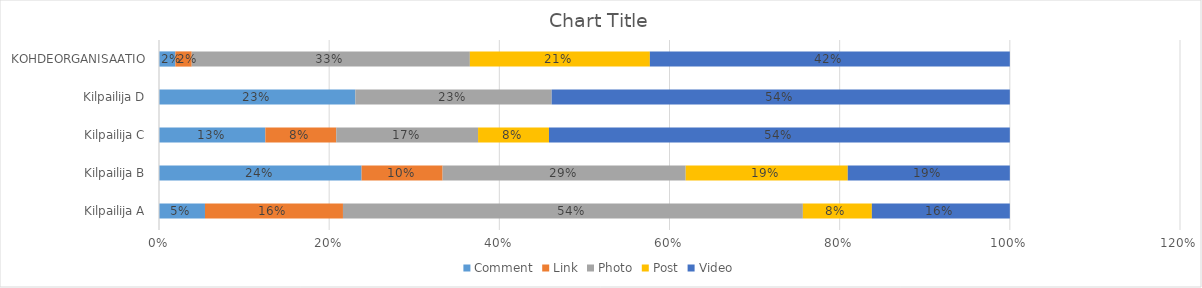
| Category | Comment | Link | Photo | Post | Video |
|---|---|---|---|---|---|
| Kilpailija A | 0.054 | 0.162 | 0.541 | 0.081 | 0.162 |
| Kilpailija B | 0.238 | 0.095 | 0.286 | 0.19 | 0.19 |
| Kilpailija C | 0.125 | 0.083 | 0.167 | 0.083 | 0.542 |
| Kilpailija D | 0.231 | 0 | 0.231 | 0 | 0.538 |
| KOHDEORGANISAATIO | 0.019 | 0.019 | 0.327 | 0.212 | 0.423 |